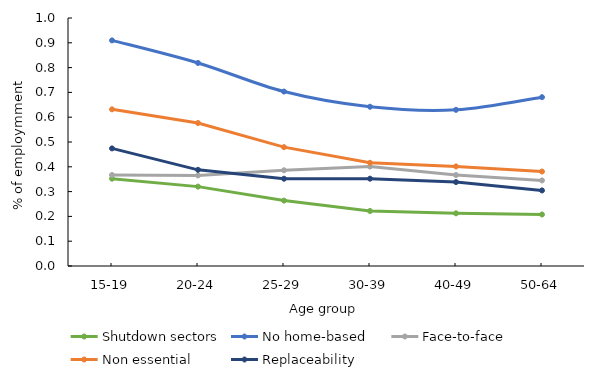
| Category | Shutdown sectors | No home-based  | Face-to-face  | Non essential | Replaceability |
|---|---|---|---|---|---|
| 15-19 | 0.352 | 0.91 | 0.367 | 0.632 | 0.474 |
| 20-24 | 0.32 | 0.819 | 0.365 | 0.576 | 0.388 |
| 25-29 | 0.264 | 0.703 | 0.386 | 0.479 | 0.352 |
| 30-39 | 0.222 | 0.642 | 0.401 | 0.416 | 0.352 |
| 40-49 | 0.212 | 0.63 | 0.367 | 0.402 | 0.338 |
| 50-64 | 0.208 | 0.681 | 0.345 | 0.381 | 0.305 |